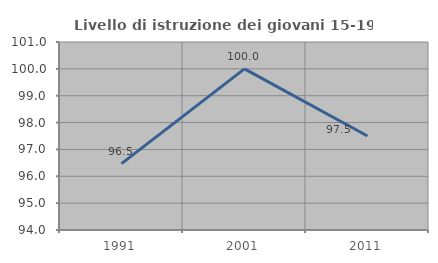
| Category | Livello di istruzione dei giovani 15-19 anni |
|---|---|
| 1991.0 | 96.471 |
| 2001.0 | 100 |
| 2011.0 | 97.5 |